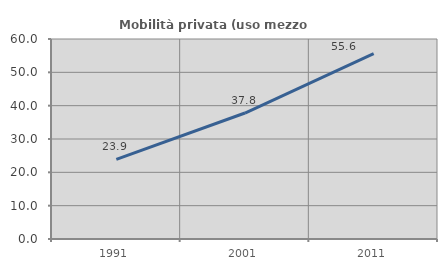
| Category | Mobilità privata (uso mezzo privato) |
|---|---|
| 1991.0 | 23.901 |
| 2001.0 | 37.791 |
| 2011.0 | 55.583 |